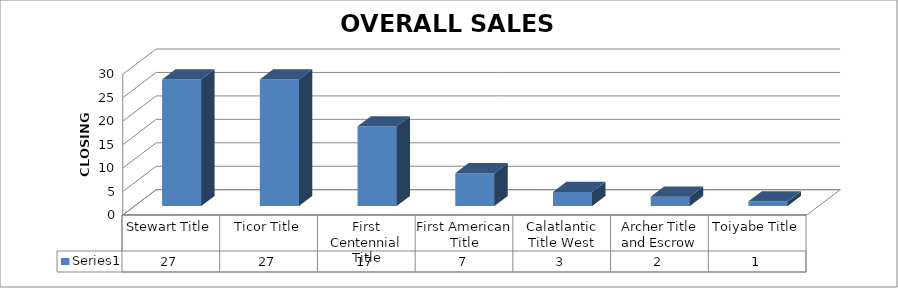
| Category | Series 0 |
|---|---|
| Stewart Title | 27 |
| Ticor Title | 27 |
| First Centennial Title | 17 |
| First American Title | 7 |
| Calatlantic Title West | 3 |
| Archer Title and Escrow | 2 |
| Toiyabe Title | 1 |